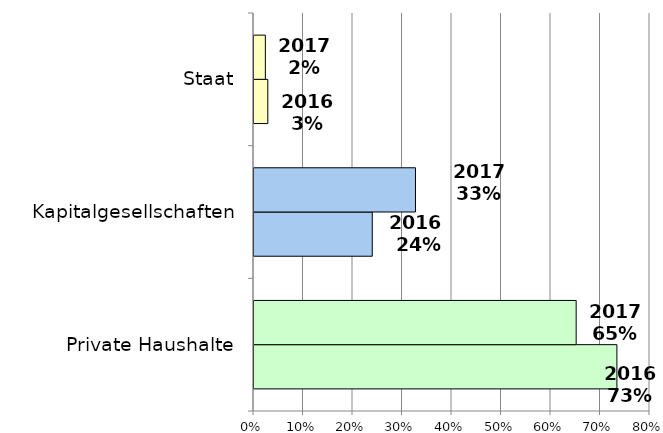
| Category | 2016 | 2017 |
|---|---|---|
| Private Haushalte | 0.733 | 0.651 |
| Kapitalgesellschaften | 0.239 | 0.326 |
| Staat | 0.028 | 0.023 |